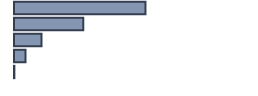
| Category | Percentatge |
|---|---|
| 0 | 54.773 |
| 1 | 28.864 |
| 2 | 11.439 |
| 3 | 4.773 |
| 4 | 0.152 |